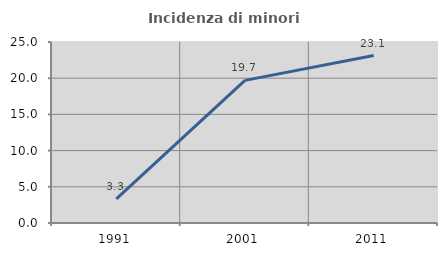
| Category | Incidenza di minori stranieri |
|---|---|
| 1991.0 | 3.333 |
| 2001.0 | 19.697 |
| 2011.0 | 23.134 |